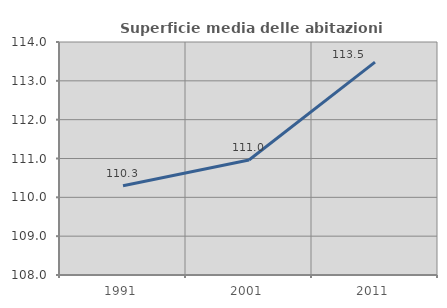
| Category | Superficie media delle abitazioni occupate |
|---|---|
| 1991.0 | 110.298 |
| 2001.0 | 110.962 |
| 2011.0 | 113.482 |